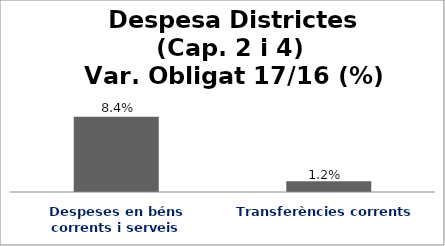
| Category | Series 0 |
|---|---|
| Despeses en béns corrents i serveis | 0.084 |
| Transferències corrents | 0.012 |